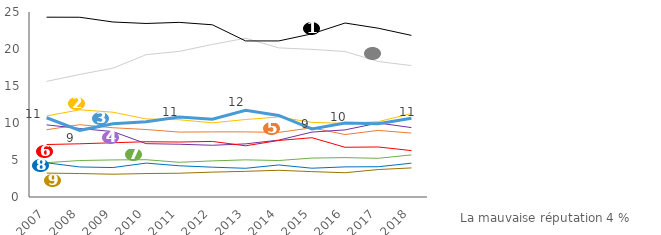
| Category | Pas de problème | Le bruit | La pollution (pollution de l'air, pollution des sols, qualité de l'eau, etc.) | Transports inadaptés (horaires, accessibilité, dessertes…) | Le manque d'équipements (sports, loisirs, santé, services,…) | Le manque d'animation (quartier dortoir, village mort) | L'environnement dégradé (mal entretenu, manque de propreté) | La délinquance | Les dangers de la circulation | La mauvaise image ou la mauvaise réputation  |
|---|---|---|---|---|---|---|---|---|---|---|
| 2007.0 | 15.62 | 9.09 | 9.75 | 10.95 | 4.64 | 7.09 | 4.62 | 10.71 | 24.3 | 3.23 |
| 2008.0 | 16.56 | 9.77 | 9.26 | 11.78 | 4.93 | 7.19 | 4.06 | 9.01 | 24.29 | 3.17 |
| 2009.0 | 17.41 | 9.36 | 8.84 | 11.46 | 5.01 | 7.33 | 3.98 | 9.89 | 23.65 | 3.08 |
| 2010.0 | 19.23 | 9.12 | 7.21 | 10.55 | 5.04 | 7.47 | 4.58 | 10.18 | 23.45 | 3.17 |
| 2011.0 | 19.68 | 8.77 | 7.13 | 10.44 | 4.69 | 7.43 | 4.22 | 10.82 | 23.6 | 3.21 |
| 2012.0 | 20.62 | 8.8 | 6.99 | 10.02 | 4.88 | 7.51 | 4.03 | 10.5 | 23.27 | 3.36 |
| 2013.0 | 21.46 | 8.8 | 7.18 | 10.47 | 5.02 | 6.92 | 3.88 | 11.71 | 21.09 | 3.47 |
| 2014.0 | 20.15 | 8.73 | 7.69 | 10.81 | 4.93 | 7.64 | 4.33 | 11.02 | 21.09 | 3.61 |
| 2015.0 | 19.95 | 9.35 | 8.77 | 10.09 | 5.26 | 8.01 | 3.89 | 9.2 | 22.05 | 3.43 |
| 2016.0 | 19.66 | 8.44 | 9.07 | 9.94 | 5.32 | 6.72 | 4.07 | 9.99 | 23.51 | 3.28 |
| 2017.0 | 18.31 | 9 | 10 | 10.18 | 5.23 | 6.76 | 4.09 | 9.91 | 22.81 | 3.71 |
| 2018.0 | 17.76 | 8.64 | 9.38 | 11.28 | 5.69 | 6.27 | 4.57 | 10.63 | 21.84 | 3.93 |